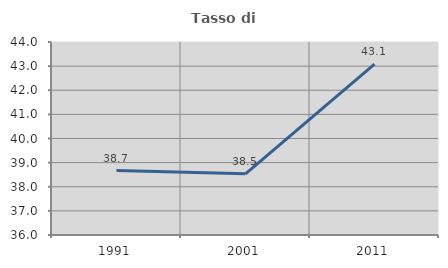
| Category | Tasso di occupazione   |
|---|---|
| 1991.0 | 38.673 |
| 2001.0 | 38.537 |
| 2011.0 | 43.084 |